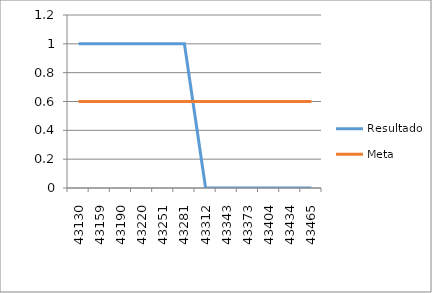
| Category | Resultado | Meta |
|---|---|---|
| 43130.0 | 1 | 0.6 |
| 43159.0 | 1 | 0.6 |
| 43190.0 | 1 | 0.6 |
| 43220.0 | 1 | 0.6 |
| 43251.0 | 1 | 0.6 |
| 43281.0 | 1 | 0.6 |
| 43312.0 | 0 | 0.6 |
| 43343.0 | 0 | 0.6 |
| 43373.0 | 0 | 0.6 |
| 43404.0 | 0 | 0.6 |
| 43434.0 | 0 | 0.6 |
| 43465.0 | 0 | 0.6 |